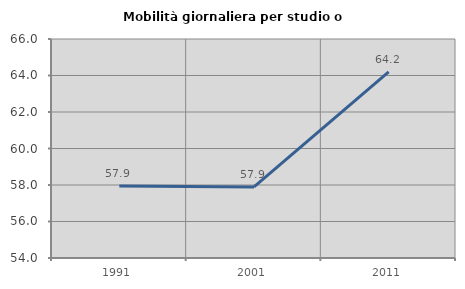
| Category | Mobilità giornaliera per studio o lavoro |
|---|---|
| 1991.0 | 57.947 |
| 2001.0 | 57.895 |
| 2011.0 | 64.198 |